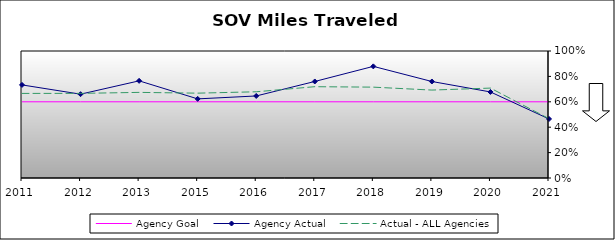
| Category | Agency Goal | Agency Actual | Actual - ALL Agencies |
|---|---|---|---|
| 2011.0 | 0.6 | 0.733 | 0.666 |
| 2012.0 | 0.6 | 0.66 | 0.666 |
| 2013.0 | 0.6 | 0.765 | 0.674 |
| 2015.0 | 0.6 | 0.623 | 0.668 |
| 2016.0 | 0.6 | 0.646 | 0.679 |
| 2017.0 | 0.6 | 0.76 | 0.719 |
| 2018.0 | 0.6 | 0.879 | 0.715 |
| 2019.0 | 0.6 | 0.76 | 0.692 |
| 2020.0 | 0.6 | 0.678 | 0.708 |
| 2021.0 | 0.6 | 0.465 | 0.467 |